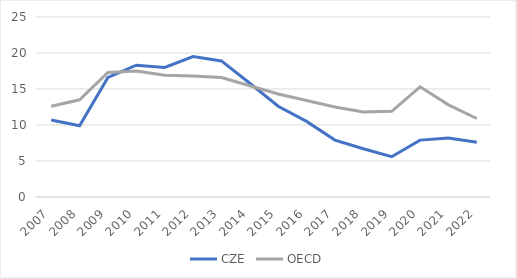
| Category | CZE | OECD |
|---|---|---|
| 2007.0 | 10.7 | 12.6 |
| 2008.0 | 9.9 | 13.5 |
| 2009.0 | 16.6 | 17.3 |
| 2010.0 | 18.3 | 17.5 |
| 2011.0 | 18 | 16.9 |
| 2012.0 | 19.5 | 16.8 |
| 2013.0 | 18.9 | 16.6 |
| 2014.0 | 15.8 | 15.45 |
| 2015.0 | 12.6 | 14.3 |
| 2016.0 | 10.5 | 13.4 |
| 2017.0 | 7.9 | 12.5 |
| 2018.0 | 6.7 | 11.8 |
| 2019.0 | 5.6 | 11.9 |
| 2020.0 | 7.9 | 15.3 |
| 2021.0 | 8.2 | 12.8 |
| 2022.0 | 7.6 | 10.9 |